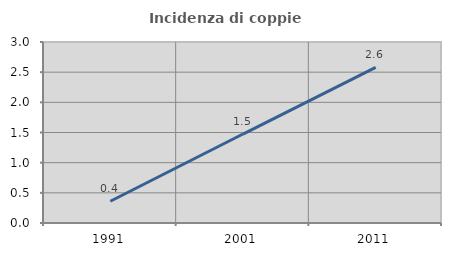
| Category | Incidenza di coppie miste |
|---|---|
| 1991.0 | 0.361 |
| 2001.0 | 1.475 |
| 2011.0 | 2.579 |